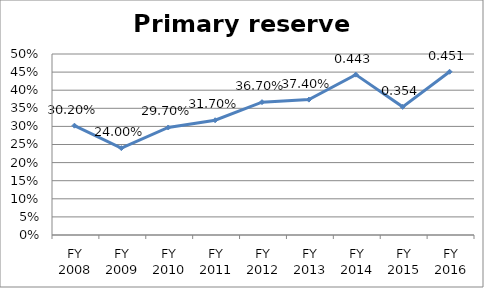
| Category | Primary reserve ratio |
|---|---|
| FY 2016 | 0.451 |
| FY 2015 | 0.354 |
| FY 2014 | 0.443 |
| FY 2013 | 0.374 |
| FY 2012 | 0.367 |
| FY 2011 | 0.317 |
| FY 2010 | 0.297 |
| FY 2009 | 0.24 |
| FY 2008 | 0.302 |